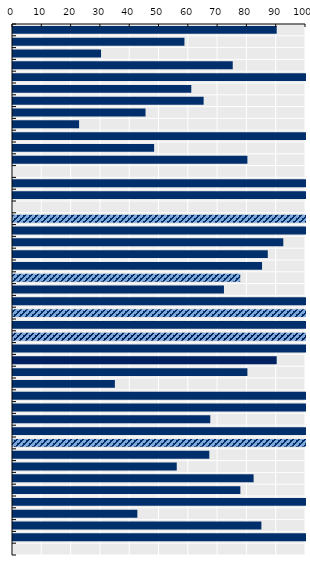
| Category | Payment rate (%) |
|---|---|
| Bulgaria | 90 |
| Greece | 58.508 |
| United Kingdom | 30.048 |
| Slovak Republic | 75 |
| Croatia | 100 |
| Czechia | 60.85 |
| Iceland | 65.061 |
| New Zealand | 45.234 |
| Ireland | 22.556 |
| Hungary | 100 |
| Denmark | 48.162 |
| Italy | 80 |
| EU average | 0 |
| Luxembourg | 100 |
| Poland | 100 |
| OECD average | 0 |
| Chile | 100 |
| Colombia | 100 |
| Norway | 92.252 |
| Malta | 86.957 |
| Romania | 85 |
| Lithuania | 77.58 |
| Cyprus | 72 |
| Costa Rica | 100 |
| Austria | 100 |
| Netherlands | 100 |
| France | 100 |
| Türkiye | 100 |
| Spain | 90 |
| Latvia | 80 |
| Canada | 34.772 |
| Israel | 100 |
| Slovenia | 100 |
| Belgium | 67.335 |
| Estonia | 100 |
| Germany | 100 |
| Japan | 67 |
| Switzerland | 55.887 |
| Korea | 82.117 |
| Sweden | 77.6 |
| Mexico | 100 |
| Australia | 42.439 |
| Finland | 84.772 |
| Portugal | 100 |
| United States | 0 |